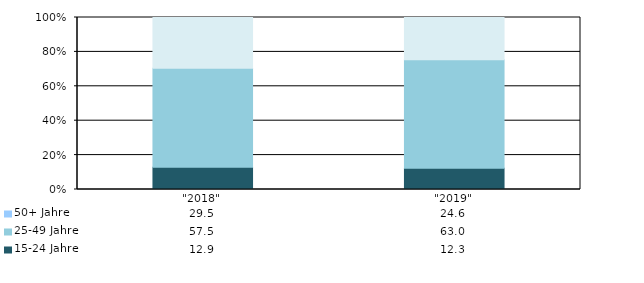
| Category | 15-24 Jahre | 25-49 Jahre | 50+ Jahre |
|---|---|---|---|
| "2018" | 12.9 | 57.5 | 29.5 |
| "2019" | 12.3 | 63 | 24.6 |